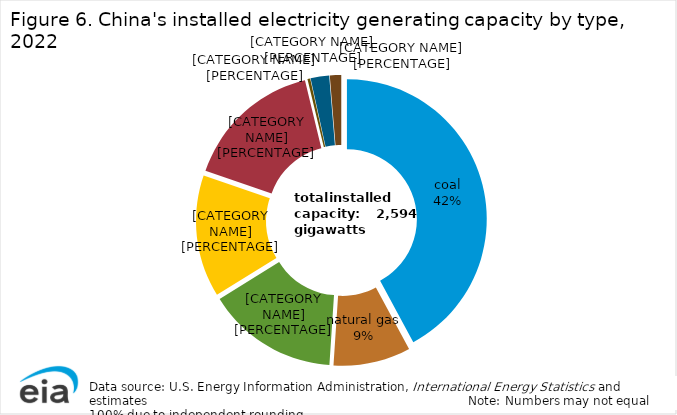
| Category | Series 0 |
|---|---|
| coal | 1092.889 |
| natural gas | 231.311 |
| solar | 392.61 |
| wind | 365.44 |
| hydro | 414 |
| oil | 8.19 |
| nuclear | 55.53 |
| other | 34 |